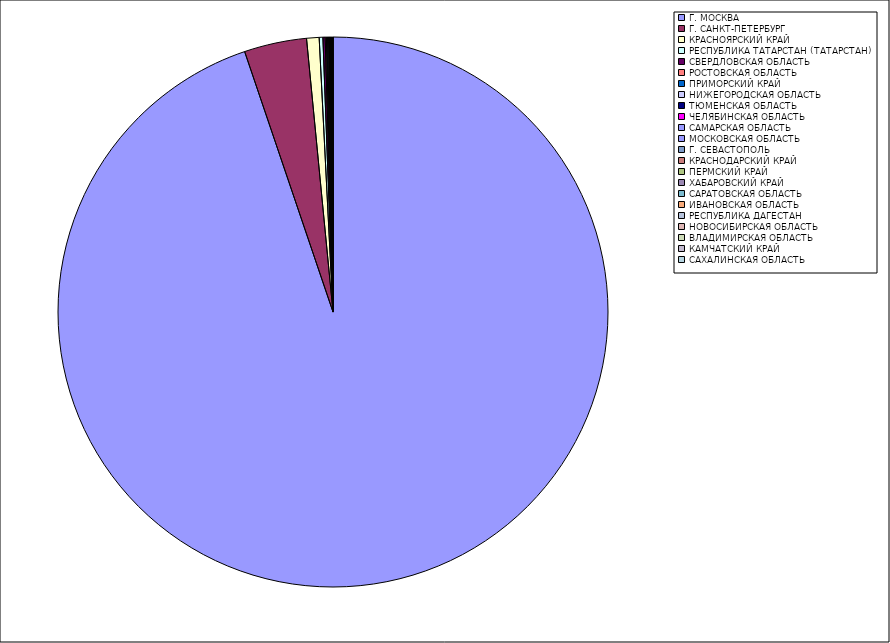
| Category | Оборот |
|---|---|
| Г. МОСКВА | 94.746 |
| Г. САНКТ-ПЕТЕРБУРГ | 3.668 |
| КРАСНОЯРСКИЙ КРАЙ | 0.734 |
| РЕСПУБЛИКА ТАТАРСТАН (ТАТАРСТАН) | 0.216 |
| СВЕРДЛОВСКАЯ ОБЛАСТЬ | 0.132 |
| РОСТОВСКАЯ ОБЛАСТЬ | 0.07 |
| ПРИМОРСКИЙ КРАЙ | 0.066 |
| НИЖЕГОРОДСКАЯ ОБЛАСТЬ | 0.06 |
| ТЮМЕНСКАЯ ОБЛАСТЬ | 0.053 |
| ЧЕЛЯБИНСКАЯ ОБЛАСТЬ | 0.037 |
| САМАРСКАЯ ОБЛАСТЬ | 0.025 |
| МОСКОВСКАЯ ОБЛАСТЬ | 0.02 |
| Г. СЕВАСТОПОЛЬ | 0.019 |
| КРАСНОДАРСКИЙ КРАЙ | 0.017 |
| ПЕРМСКИЙ КРАЙ | 0.013 |
| ХАБАРОВСКИЙ КРАЙ | 0.013 |
| САРАТОВСКАЯ ОБЛАСТЬ | 0.012 |
| ИВАНОВСКАЯ ОБЛАСТЬ | 0.012 |
| РЕСПУБЛИКА ДАГЕСТАН | 0.011 |
| НОВОСИБИРСКАЯ ОБЛАСТЬ | 0.008 |
| ВЛАДИМИРСКАЯ ОБЛАСТЬ | 0.007 |
| КАМЧАТСКИЙ КРАЙ | 0.006 |
| САХАЛИНСКАЯ ОБЛАСТЬ | 0.005 |